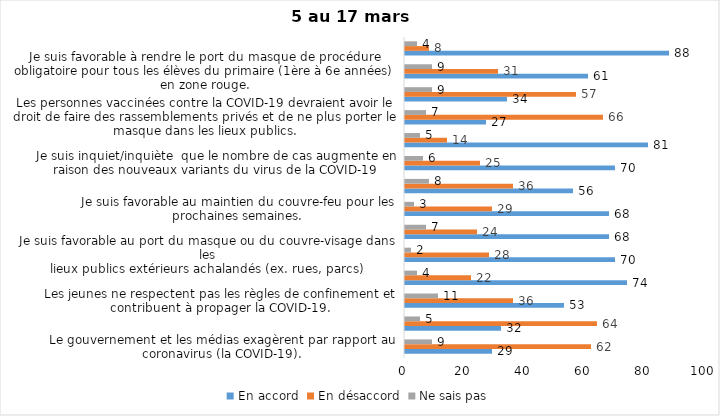
| Category | En accord | En désaccord | Ne sais pas |
|---|---|---|---|
| Le gouvernement et les médias exagèrent par rapport au coronavirus (la COVID-19). | 29 | 62 | 9 |
| Il est exagéré de rester chez soi pour se protéger contre le coronavirus (la COVID-19). | 32 | 64 | 5 |
| Les jeunes ne respectent pas les règles de confinement et contribuent à propager la COVID-19. | 53 | 36 | 11 |
| C’est une bonne chose que les policiers puissent donner facilement des contraventions aux gens qui ne respectent pas les mesures pour prévenir le coronavirus (la COVID-19). | 74 | 22 | 4 |
| Je suis favorable au port du masque ou du couvre-visage dans les
lieux publics extérieurs achalandés (ex. rues, parcs) | 70 | 28 | 2 |
| Les activités extérieures en petits groupes sont sécuritaires pour éviter la propagation de la COVID-19. | 68 | 24 | 7 |
| Je suis favorable au maintien du couvre-feu pour les prochaines semaines. | 68 | 29 | 3 |
| J’ai peur que le système de santé soit débordé par les cas de COVID-19 suite à l’assouplissement des mesures | 56 | 36 | 8 |
| Je suis inquiet/inquiète  que le nombre de cas augmente en raison des nouveaux variants du virus de la COVID-19 | 70 | 25 | 6 |
| La frontière entre le Canada et les États-Unis devrait être fermée au moins jusqu’en septembre 2021 | 81 | 14 | 5 |
| Les personnes vaccinées contre la COVID-19 devraient avoir le droit de faire des rassemblements privés et de ne plus porter le masque dans les lieux publics. | 27 | 66 | 7 |
| Je crois que le gouvernement a implanté trop de mesures par rapport à ce que la santé publique recommandait (ex. : fermeture des restaurants). | 34 | 57 | 9 |
| Je suis favorable à rendre le port du masque de procédure obligatoire pour tous les élèves du primaire (1ère à 6e années) en zone rouge. | 61 | 31 | 9 |
| Pour éviter la propagation de la COVID-19, c’est une bonne chose que le gouvernement maintiennent des mesures préventives plus strictes pour les régions entourant Montréal. | 88 | 8 | 4 |